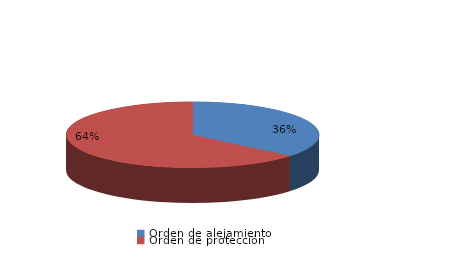
| Category | Series 0 |
|---|---|
| Orden de alejamiento | 44 |
| Orden de protección | 78 |